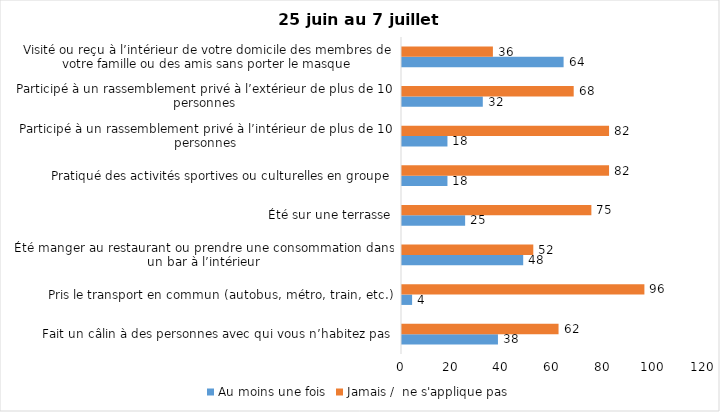
| Category | Au moins une fois | Jamais /  ne s'applique pas |
|---|---|---|
| Fait un câlin à des personnes avec qui vous n’habitez pas | 38 | 62 |
| Pris le transport en commun (autobus, métro, train, etc.) | 4 | 96 |
| Été manger au restaurant ou prendre une consommation dans un bar à l’intérieur | 48 | 52 |
| Été sur une terrasse | 25 | 75 |
| Pratiqué des activités sportives ou culturelles en groupe | 18 | 82 |
| Participé à un rassemblement privé à l’intérieur de plus de 10 personnes | 18 | 82 |
| Participé à un rassemblement privé à l’extérieur de plus de 10 personnes | 32 | 68 |
| Visité ou reçu à l’intérieur de votre domicile des membres de votre famille ou des amis sans porter le masque | 64 | 36 |